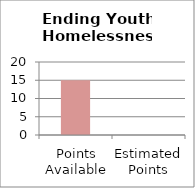
| Category | Ending Youth Homelessness |
|---|---|
| Points Available | 15 |
| Estimated Points | 0 |